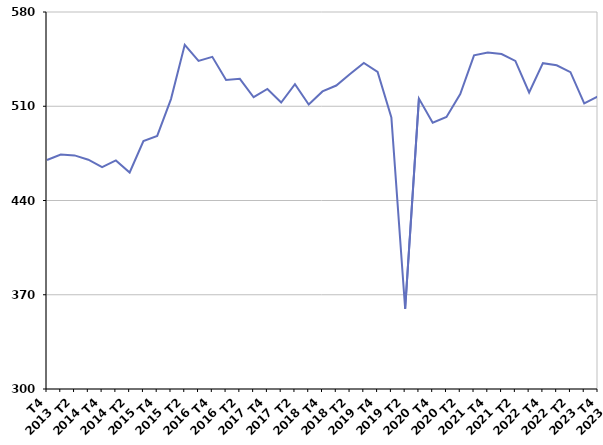
| Category | Ensemble des sorties de catégories A, B, C |
|---|---|
| T4
2013 | 470.1 |
| T1
2014 | 474.2 |
| T2
2014 | 473.5 |
| T3
2014 | 470.3 |
| T4
2014 | 464.7 |
| T1
2015 | 469.8 |
| T2
2015 | 460.8 |
| T3
2015 | 484.2 |
| T4
2015 | 488 |
| T1
2016 | 515.3 |
| T2
2016 | 555.6 |
| T3
2016 | 543.7 |
| T4
2016 | 546.7 |
| T1
2017 | 529.5 |
| T2
2017 | 530.4 |
| T3
2017 | 516.7 |
| T4
2017 | 522.8 |
| T1
2018 | 512.8 |
| T2
2018 | 526.4 |
| T3
2018 | 511.3 |
| T4
2018 | 521 |
| T1
2019 | 525.4 |
| T2
2019 | 533.9 |
| T3
2019 | 542.1 |
| T4
2019 | 535.5 |
| T1
2020 | 501.7 |
| T2
2020 | 359.6 |
| T3
2020 | 515.7 |
| T4
2020 | 497.8 |
| T1
2021 | 502 |
| T2
2021 | 519.1 |
| T3
2021 | 547.8 |
| T4
2021 | 549.9 |
| T1
2022 | 548.8 |
| T2
2022 | 543.7 |
| T3
2022 | 520.2 |
| T4
2022 | 542 |
| T1
2023 | 540.4 |
| T2
2023 | 535.3 |
| T3
2023 | 512.2 |
| T4
2023 | 517.3 |